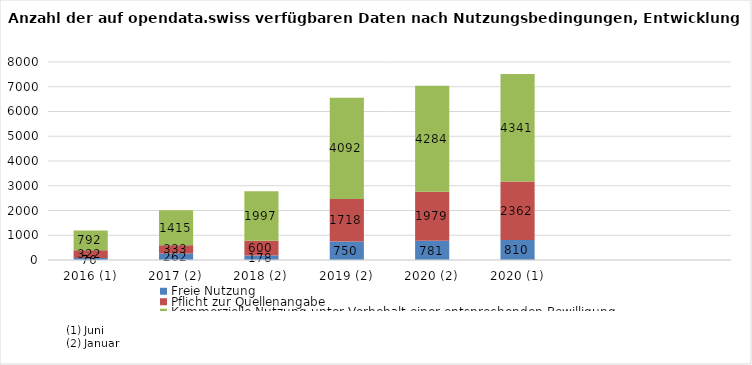
| Category | Freie Nutzung | Pflicht zur Quellenangabe | Kommerzielle Nutzung unter Vorbehalt einer entsprechenden Bewilligung |
|---|---|---|---|
| 2016 (1) | 76 | 322 | 792 |
| 2017 (2) | 262 | 333 | 1415 |
| 2018 (2) | 178 | 600 | 1997 |
| 2019 (2) | 750 | 1718 | 4092 |
| 2020 (2) | 781 | 1979 | 4284 |
| 2020 (1) | 810 | 2362 | 4341 |